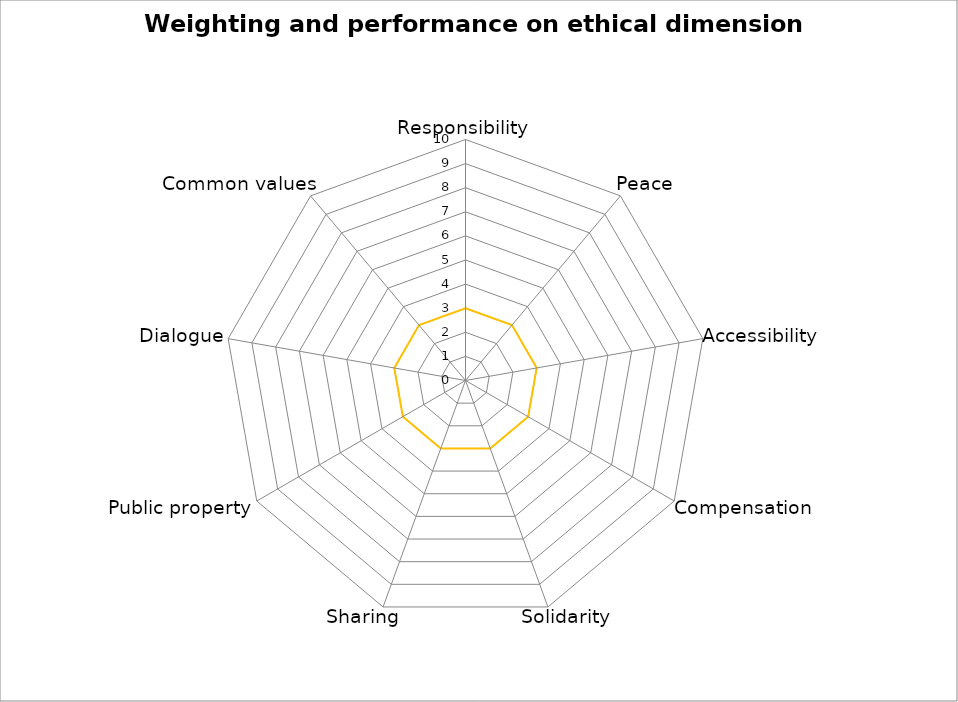
| Category | Performance | Weighting | Series 2 |
|---|---|---|---|
| Responsibility | 0 | 0 | 3 |
| Peace | 0 | 0 | 3 |
| Accessibility | 0 | 0 | 3 |
| Compensation | 0 | 0 | 3 |
| Solidarity | 0 | 0 | 3 |
| Sharing | 0 | 0 | 3 |
| Public property | 0 | 0 | 3 |
| Dialogue | 0 | 0 | 3 |
| Common values | 0 | 0 | 3 |